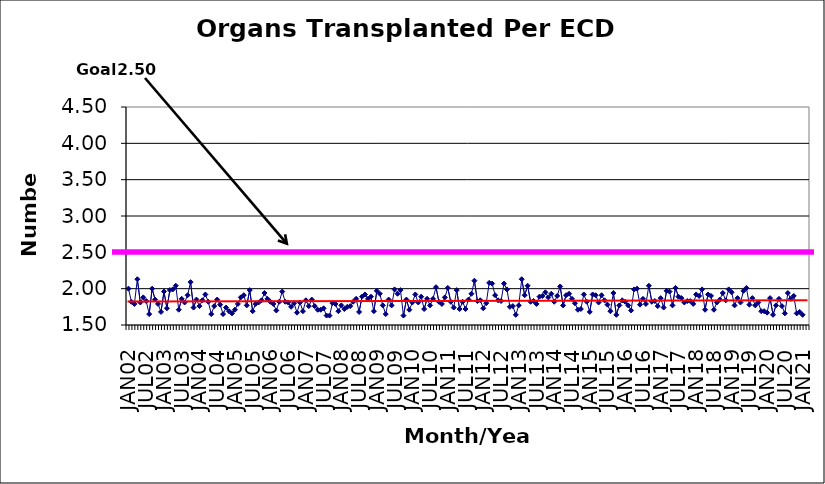
| Category | Series 0 |
|---|---|
| JAN02 | 2 |
| FEB02 | 1.82 |
| MAR02 | 1.79 |
| APR02 | 2.13 |
| MAY02 | 1.81 |
| JUN02 | 1.88 |
| JUL02 | 1.83 |
| AUG02 | 1.65 |
| SEP02 | 2 |
| OCT02 | 1.85 |
| NOV02 | 1.79 |
| DEC02 | 1.68 |
| JAN03 | 1.96 |
| FEB03 | 1.73 |
| MAR03 | 1.98 |
| APR03 | 1.99 |
| MAY03 | 2.04 |
| JUN03 | 1.71 |
| JUL03 | 1.86 |
| AUG03 | 1.81 |
| SEP03 | 1.91 |
| OCT03 | 2.09 |
| NOV03 | 1.74 |
| DEC03 | 1.85 |
| JAN04 | 1.76 |
| FEB04 | 1.84 |
| MAR04 | 1.92 |
| APR04 | 1.82 |
| MAY04 | 1.65 |
| JUN04 | 1.76 |
| JUL04 | 1.85 |
| AUG04 | 1.78 |
| SEP04 | 1.65 |
| OCT04 | 1.74 |
| NOV04 | 1.69 |
| DEC04 | 1.66 |
| JAN05 | 1.71 |
| FEB05 | 1.79 |
| MAR05 | 1.88 |
| APR05 | 1.91 |
| MAY05 | 1.77 |
| JUN05 | 1.98 |
| JUL05 | 1.69 |
| AUG05 | 1.79 |
| SEP05 | 1.81 |
| OCT05 | 1.84 |
| NOV05 | 1.94 |
| DEC05 | 1.86 |
| JAN06 | 1.82 |
| FEB06 | 1.79 |
| MAR06 | 1.7 |
| APR06 | 1.82 |
| MAY06 | 1.96 |
| JUN06 | 1.82 |
| JUL06 | 1.81 |
| AUG06 | 1.75 |
| SEP06 | 1.8 |
| OCT06 | 1.67 |
| NOV06 | 1.81 |
| DEC06 | 1.69 |
| JAN07 | 1.84 |
| FEB07 | 1.76 |
| MAR07 | 1.85 |
| APR07 | 1.76 |
| MAY07 | 1.71 |
| JUN07 | 1.71 |
| JUL07 | 1.73 |
| AUG07 | 1.63 |
| SEP07 | 1.63 |
| OCT07 | 1.8 |
| NOV07 | 1.79 |
| DEC07 | 1.69 |
| JAN08 | 1.77 |
| FEB08 | 1.72 |
| MAR08 | 1.75 |
| APR08 | 1.76 |
| MAY08 | 1.82 |
| JUN08 | 1.86 |
| JUL08 | 1.68 |
| AUG08 | 1.89 |
| SEP08 | 1.92 |
| OCT08 | 1.86 |
| NOV08 | 1.89 |
| DEC08 | 1.69 |
| JAN09 | 1.97 |
| FEB09 | 1.93 |
| MAR09 | 1.77 |
| APR09 | 1.65 |
| MAY09 | 1.85 |
| JUN09 | 1.77 |
| JUL09 | 1.99 |
| AUG09 | 1.93 |
| SEP09 | 1.98 |
| OCT09 | 1.63 |
| NOV09 | 1.85 |
| DEC09 | 1.71 |
| JAN10 | 1.81 |
| FEB10 | 1.92 |
| MAR10 | 1.81 |
| APR10 | 1.89 |
| MAY10 | 1.72 |
| JUN10 | 1.86 |
| JUL10 | 1.77 |
| AUG10 | 1.86 |
| SEP10 | 2.02 |
| OCT10 | 1.82 |
| NOV10 | 1.79 |
| DEC10 | 1.88 |
| JAN11 | 2.01 |
| FEB11 | 1.82 |
| MAR11 | 1.74 |
| APR11 | 1.98 |
| MAY11 | 1.72 |
| JUN11 | 1.82 |
| JUL11 | 1.72 |
| AUG11 | 1.85 |
| SEP11 | 1.93 |
| OCT11 | 2.11 |
| NOV11 | 1.83 |
| DEC11 | 1.84 |
| JAN12 | 1.73 |
| FEB12 | 1.8 |
| MAR12 | 2.08 |
| APR12 | 2.07 |
| MAY12 | 1.91 |
| JUN12 | 1.84 |
| JUL12 | 1.83 |
| AUG12 | 2.07 |
| SEP12 | 1.99 |
| OCT12 | 1.75 |
| NOV12 | 1.76 |
| DEC12 | 1.64 |
| JAN13 | 1.77 |
| FEB13 | 2.13 |
| MAR13 | 1.91 |
| APR13 | 2.04 |
| MAY13 | 1.82 |
| JUN13 | 1.83 |
| JUL13 | 1.79 |
| AUG13 | 1.89 |
| SEP13 | 1.9 |
| OCT13 | 1.95 |
| NOV13 | 1.88 |
| DEC13 | 1.93 |
| JAN14 | 1.82 |
| FEB14 | 1.9 |
| MAR14 | 2.03 |
| APR14 | 1.77 |
| MAY14 | 1.91 |
| JUN14 | 1.93 |
| JUL14 | 1.86 |
| AUG14 | 1.8 |
| SEP14 | 1.71 |
| OCT14 | 1.72 |
| NOV14 | 1.92 |
| DEC14 | 1.82 |
| JAN15 | 1.68 |
| FEB15 | 1.92 |
| MAR15 | 1.91 |
| APR15 | 1.81 |
| MAY15 | 1.91 |
| JUN15 | 1.84 |
| JUL15 | 1.78 |
| AUG15 | 1.69 |
| SEP15 | 1.94 |
| OCT15 | 1.64 |
| NOV15 | 1.77 |
| DEC15 | 1.84 |
| JAN16 | 1.82 |
| FEB16 | 1.77 |
| MAR16 | 1.7 |
| APR16 | 1.99 |
| MAY16 | 2 |
| JUN16 | 1.78 |
| JUL16 | 1.86 |
| AUG16 | 1.79 |
| SEP16 | 2.04 |
| OCT16 | 1.82 |
| NOV16 | 1.83 |
| DEC16 | 1.76 |
| JAN17 | 1.87 |
| FEB17 | 1.74 |
| MAR17 | 1.97 |
| APR17 | 1.96 |
| MAY17 | 1.77 |
| JUN17 | 2.01 |
| JUL17 | 1.89 |
| AUG17 | 1.87 |
| SEP17 | 1.81 |
| OCT17 | 1.83 |
| NOV17 | 1.83 |
| DEC17 | 1.79 |
| JAN18 | 1.92 |
| FEB18 | 1.9 |
| MAR18 | 1.99 |
| APR18 | 1.71 |
| MAY18 | 1.92 |
| JUN18 | 1.9 |
| JUL18 | 1.71 |
| AUG18 | 1.81 |
| SEP18 | 1.85 |
| OCT18 | 1.94 |
| NOV18 | 1.84 |
| DEC18 | 1.99 |
| JAN19 | 1.95 |
| FEB19 | 1.77 |
| MAR19 | 1.87 |
| APR19 | 1.81 |
| MAY19 | 1.97 |
| JUN19 | 2.01 |
| JUL19 | 1.78 |
| AUG19 | 1.87 |
| SEP19 | 1.77 |
| OCT19 | 1.81 |
| NOV19 | 1.69 |
| DEC19 | 1.69 |
| JAN20 | 1.67 |
| FEB20 | 1.87 |
| MAR20 | 1.64 |
| APR20 | 1.77 |
| MAY20 | 1.86 |
| JUN20 | 1.76 |
| JUL20 | 1.66 |
| AUG20 | 1.94 |
| SEP20 | 1.86 |
| OCT20 | 1.9 |
| NOV20 | 1.66 |
| DEC20 | 1.68 |
| JAN21 | 1.64 |